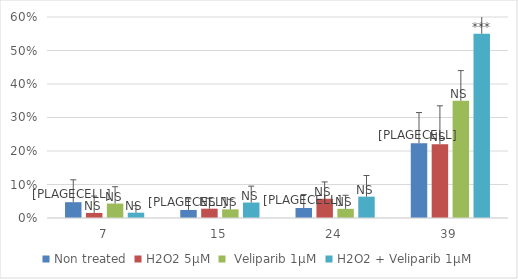
| Category | Non treated | H2O2 5µM |  Veliparib 1µM | H2O2 + Veliparib 1µM |
|---|---|---|---|---|
| 7.0 | 0.047 | 0.015 | 0.043 | 0.016 |
| 15.0 | 0.024 | 0.028 | 0.026 | 0.046 |
| 24.0 | 0.03 | 0.057 | 0.027 | 0.064 |
| 39.0 | 0.223 | 0.22 | 0.35 | 0.55 |